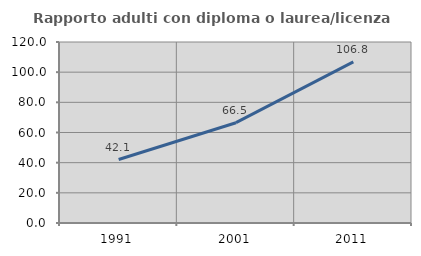
| Category | Rapporto adulti con diploma o laurea/licenza media  |
|---|---|
| 1991.0 | 42.085 |
| 2001.0 | 66.496 |
| 2011.0 | 106.809 |